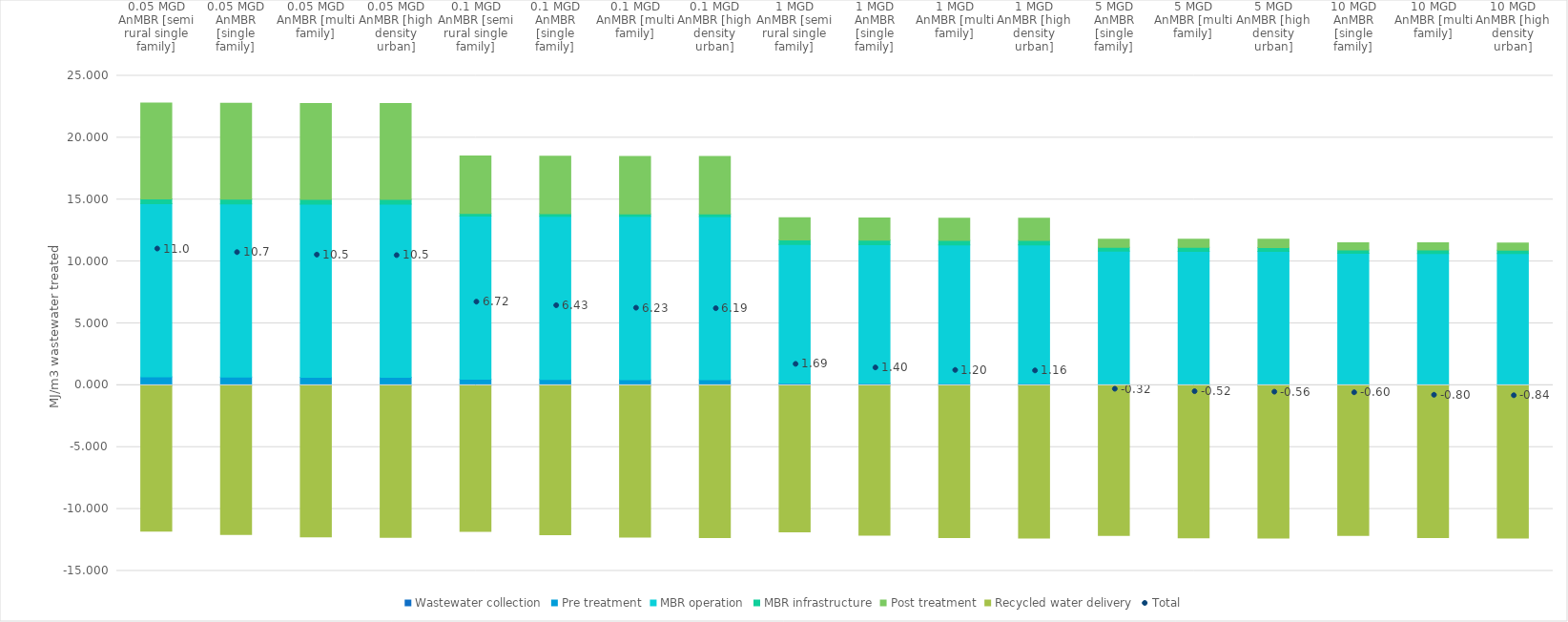
| Category | Wastewater collection | Pre treatment | MBR operation | MBR infrastructure | Post treatment | Recycled water delivery |
|---|---|---|---|---|---|---|
| 0.05 MGD AnMBR [semi rural single family] | 0.04 | 0.65 | 13.985 | 0.387 | 7.739 | -11.791 |
| 0.05 MGD AnMBR [single family] | 0.021 | 0.65 | 13.985 | 0.387 | 7.739 | -12.061 |
| 0.05 MGD AnMBR [multi family] | 0.005 | 0.65 | 13.985 | 0.387 | 7.739 | -12.245 |
| 0.05 MGD AnMBR [high density urban] | 0.003 | 0.65 | 13.985 | 0.387 | 7.739 | -12.284 |
| 0.1 MGD AnMBR [semi rural single family] | 0.038 | 0.452 | 13.186 | 0.199 | 4.643 | -11.803 |
| 0.1 MGD AnMBR [single family] | 0.02 | 0.452 | 13.186 | 0.199 | 4.643 | -12.07 |
| 0.1 MGD AnMBR [multi family] | 0.005 | 0.452 | 13.186 | 0.199 | 4.643 | -12.257 |
| 0.1 MGD AnMBR [high density urban] | 0.003 | 0.452 | 13.186 | 0.199 | 4.643 | -12.295 |
| 1 MGD AnMBR [semi rural single family] | 0.04 | 0.143 | 11.187 | 0.375 | 1.794 | -11.845 |
| 1 MGD AnMBR [single family] | 0.02 | 0.143 | 11.187 | 0.375 | 1.794 | -12.113 |
| 1 MGD AnMBR [multi family] | 0.005 | 0.143 | 11.187 | 0.375 | 1.794 | -12.3 |
| 1 MGD AnMBR [high density urban] | 0.003 | 0.143 | 11.187 | 0.375 | 1.794 | -12.337 |
| 5 MGD AnMBR [single family] | 0.017 | 0.07 | 10.751 | 0.313 | 0.658 | -12.126 |
| 5 MGD AnMBR [multi family] | 0.005 | 0.07 | 10.751 | 0.313 | 0.658 | -12.313 |
| 5 MGD AnMBR [high density urban] | 0.003 | 0.07 | 10.751 | 0.313 | 0.658 | -12.35 |
| 10 MGD AnMBR [single family] | 0.02 | 0.053 | 10.585 | 0.281 | 0.58 | -12.122 |
| 10 MGD AnMBR [multi family] | 0.006 | 0.053 | 10.585 | 0.281 | 0.58 | -12.309 |
| 10 MGD AnMBR [high density urban] | 0.003 | 0.053 | 10.585 | 0.281 | 0.58 | -12.346 |